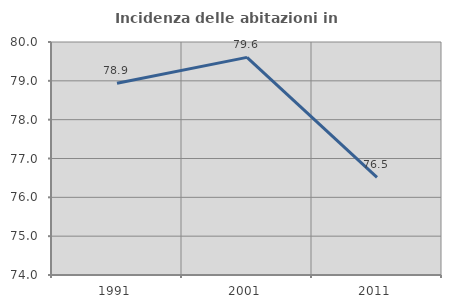
| Category | Incidenza delle abitazioni in proprietà  |
|---|---|
| 1991.0 | 78.938 |
| 2001.0 | 79.604 |
| 2011.0 | 76.515 |